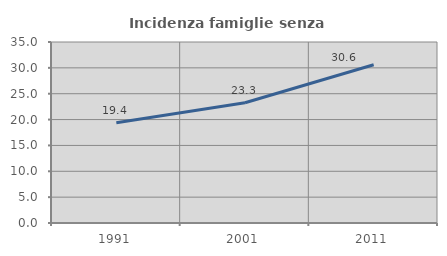
| Category | Incidenza famiglie senza nuclei |
|---|---|
| 1991.0 | 19.397 |
| 2001.0 | 23.263 |
| 2011.0 | 30.605 |